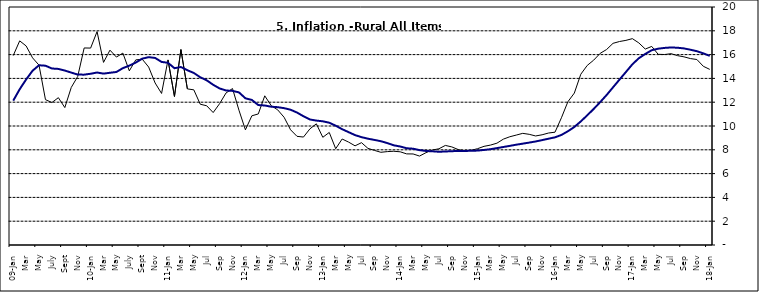
| Category | Year-on Rate | 12-Month Average |
|---|---|---|
| 09-Jan | 15.918 | 12.128 |
| Feb | 17.154 | 13.086 |
| Mar | 16.729 | 13.912 |
| Apr | 15.727 | 14.644 |
| May | 15.113 | 15.104 |
| June | 12.213 | 15.067 |
| July | 11.974 | 14.832 |
| Aug | 12.38 | 14.796 |
| Sept | 11.548 | 14.661 |
| Oct | 13.242 | 14.488 |
| Nov | 14.164 | 14.321 |
|  | 16.557 | 14.316 |
| 10-Jan | 16.548 | 14.39 |
| Feb | 17.934 | 14.494 |
| Mar | 15.346 | 14.401 |
| Apr | 16.373 | 14.473 |
| May | 15.794 | 14.54 |
| June | 16.126 | 14.862 |
| July | 14.634 | 15.072 |
| Aug | 15.556 | 15.33 |
| Sept | 15.616 | 15.658 |
| Oct | 14.955 | 15.786 |
| Nov | 13.616 | 15.719 |
| Dec | 12.735 | 15.385 |
| 11-Jan | 15.553 | 15.311 |
| Feb | 12.482 | 14.856 |
| Mar | 16.422 | 14.956 |
| Apr | 13.117 | 14.687 |
| May | 13.041 | 14.457 |
| Jun | 11.83 | 14.095 |
| Jul | 11.699 | 13.84 |
| Aug | 11.13 | 13.464 |
| Sep | 11.878 | 13.156 |
| Oct | 12.778 | 12.985 |
| Nov | 13.147 | 12.95 |
| Dec | 11.326 | 12.824 |
| 12-Jan | 9.678 | 12.33 |
| Feb | 10.856 | 12.188 |
| Mar | 11.014 | 11.76 |
| Apr | 12.536 | 11.724 |
| May | 11.712 | 11.621 |
| Jun | 11.36 | 11.582 |
| Jul | 10.733 | 11.499 |
| Aug | 9.683 | 11.368 |
| Sep | 9.132 | 11.131 |
| Oct | 9.071 | 10.82 |
| Nov | 9.758 | 10.548 |
| Dec | 10.183 | 10.455 |
| 13-Jan | 9.052 | 10.394 |
| Feb | 9.457 | 10.276 |
| Mar | 8.091 | 10.025 |
| Apr | 8.907 | 9.732 |
| May | 8.647 | 9.483 |
| Jun | 8.333 | 9.236 |
| Jul | 8.6 | 9.063 |
| Aug | 8.12 | 8.933 |
| Sep | 7.95 | 8.832 |
| Oct | 7.791 | 8.722 |
| Nov | 7.849 | 8.565 |
| Dec | 7.879 | 8.378 |
| 14-Jan | 7.832 | 8.277 |
| Feb | 7.657 | 8.13 |
| Mar | 7.65 | 8.092 |
| Apr | 7.473 | 7.973 |
| May | 7.761 | 7.901 |
| Jun | 7.98 | 7.874 |
| Jul | 8.086 | 7.834 |
| Aug | 8.368 | 7.858 |
| Sep | 8.244 | 7.883 |
| Oct | 8.019 | 7.903 |
| Nov | 7.898 | 7.906 |
| Dec | 7.955 | 7.913 |
| 15-Jan | 8.094 | 7.935 |
| Feb | 8.291 | 7.988 |
| Mar | 8.396 | 8.05 |
| Apr | 8.556 | 8.14 |
| May | 8.896 | 8.236 |
| Jun | 9.098 | 8.331 |
| Jul | 9.238 | 8.429 |
| Aug | 9.382 | 8.516 |
| Sep | 9.3 | 8.606 |
| Oct | 9.162 | 8.7 |
| Nov | 9.261 | 8.813 |
| Dec | 9.41 | 8.933 |
| 16-Jan | 9.48 | 9.047 |
| Feb | 10.692 | 9.249 |
| Mar | 12.038 | 9.559 |
| Apr | 12.767 | 9.917 |
| May | 14.349 | 10.384 |
| Jun | 15.088 | 10.897 |
| Jul | 15.533 | 11.433 |
| Aug | 16.103 | 12.002 |
| Sep | 16.428 | 12.601 |
| Oct | 16.947 | 13.25 |
| Nov | 17.099 | 13.898 |
| Dec | 17.195 | 14.54 |
| 17-Jan | 17.341 | 15.183 |
| Feb | 16.982 | 15.696 |
| Mar | 16.466 | 16.054 |
| Apr | 16.687 | 16.369 |
| May | 16.023 | 16.497 |
| Jun | 16.007 | 16.563 |
| Jul | 16.078 | 16.6 |
| Aug | 15.914 | 16.577 |
| Sep | 15.812 | 16.52 |
| Oct | 15.666 | 16.411 |
| Nov | 15.587 | 16.285 |
| Dec | 15.018 | 16.104 |
| 18-Jan | 14.756 | 15.892 |